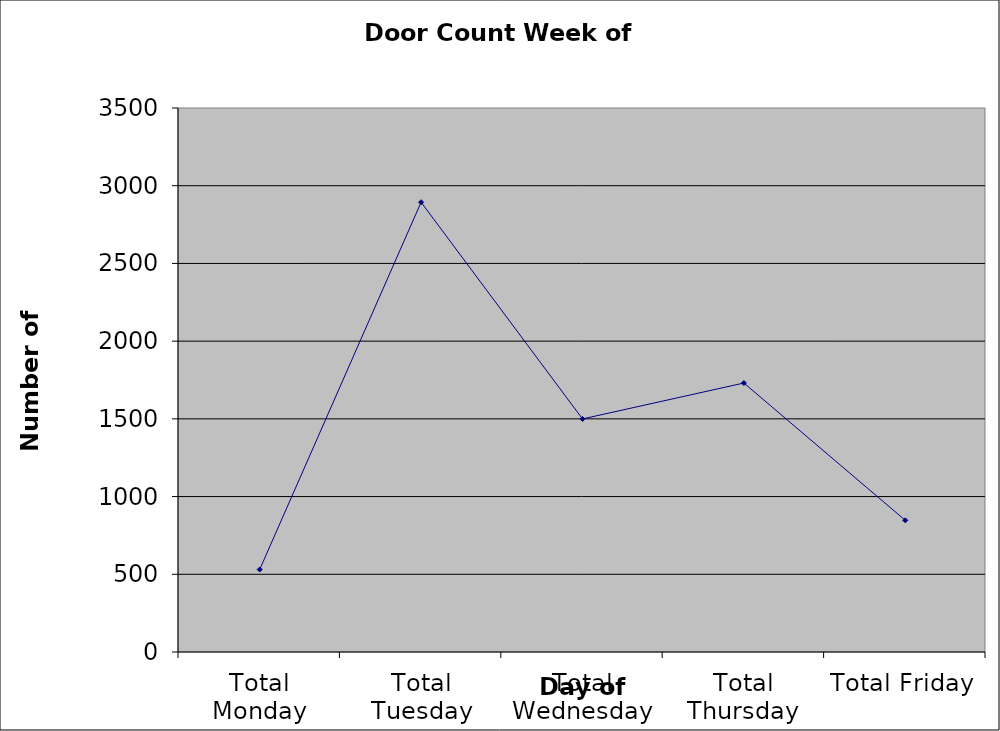
| Category | Series 0 |
|---|---|
| Total Monday | 530.5 |
| Total Tuesday | 2894 |
| Total Wednesday | 1499.5 |
| Total Thursday | 1730.5 |
| Total Friday | 847 |